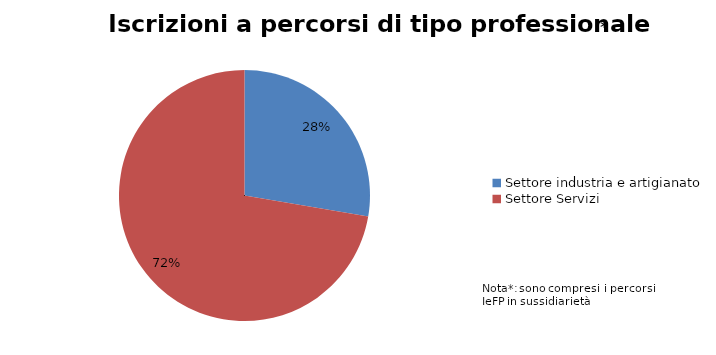
| Category | Series 0 |
|---|---|
| Settore industria e artigianato | 2210 |
| Settore Servizi | 5771 |